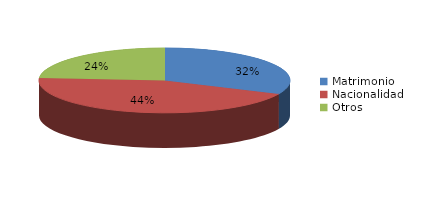
| Category | Series 0 |
|---|---|
| Matrimonio | 1551 |
| Nacionalidad | 2157 |
| Otros | 1162 |